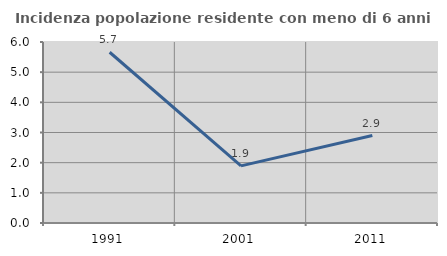
| Category | Incidenza popolazione residente con meno di 6 anni |
|---|---|
| 1991.0 | 5.66 |
| 2001.0 | 1.893 |
| 2011.0 | 2.899 |